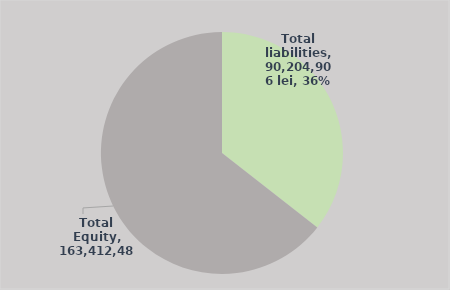
| Category | Series 0 |
|---|---|
| Total liabilities | 90204906.1 |
| Total Equity | 163412485 |